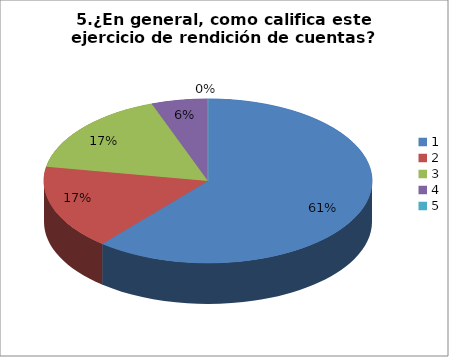
| Category | Series 0 |
|---|---|
| 0 | 33 |
| 1 | 9 |
| 2 | 9 |
| 3 | 3 |
| 4 | 0 |